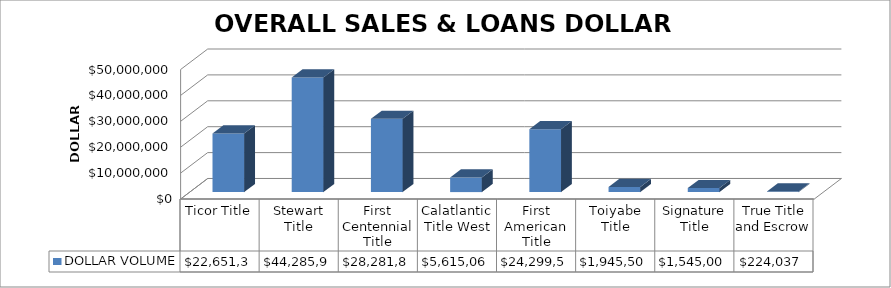
| Category | DOLLAR VOLUME |
|---|---|
| Ticor Title | 22651377 |
| Stewart Title | 44285962 |
| First Centennial Title | 28281864 |
| Calatlantic Title West | 5615060 |
| First American Title | 24299500 |
| Toiyabe Title | 1945500 |
| Signature Title | 1545000 |
| True Title and Escrow | 224037 |